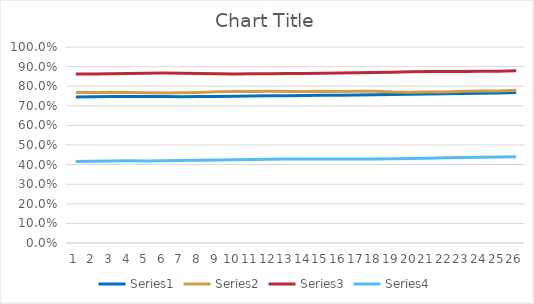
| Category | Series 0 | Series 1 | Series 2 | Series 3 |
|---|---|---|---|---|
| 0 | 0.745 | 0.767 | 0.862 | 0.415 |
| 1 | 0.746 | 0.768 | 0.863 | 0.417 |
| 2 | 0.747 | 0.769 | 0.864 | 0.418 |
| 3 | 0.747 | 0.768 | 0.865 | 0.419 |
| 4 | 0.747 | 0.766 | 0.866 | 0.419 |
| 5 | 0.747 | 0.766 | 0.867 | 0.42 |
| 6 | 0.747 | 0.766 | 0.866 | 0.42 |
| 7 | 0.747 | 0.768 | 0.864 | 0.422 |
| 8 | 0.748 | 0.771 | 0.863 | 0.423 |
| 9 | 0.749 | 0.773 | 0.863 | 0.424 |
| 10 | 0.75 | 0.774 | 0.863 | 0.426 |
| 11 | 0.751 | 0.774 | 0.864 | 0.428 |
| 12 | 0.752 | 0.773 | 0.865 | 0.428 |
| 13 | 0.752 | 0.773 | 0.865 | 0.429 |
| 14 | 0.753 | 0.774 | 0.866 | 0.429 |
| 15 | 0.754 | 0.773 | 0.867 | 0.428 |
| 16 | 0.755 | 0.774 | 0.868 | 0.428 |
| 17 | 0.757 | 0.774 | 0.87 | 0.429 |
| 18 | 0.757 | 0.771 | 0.872 | 0.43 |
| 19 | 0.759 | 0.77 | 0.873 | 0.431 |
| 20 | 0.761 | 0.77 | 0.875 | 0.433 |
| 21 | 0.762 | 0.771 | 0.875 | 0.434 |
| 22 | 0.763 | 0.774 | 0.875 | 0.437 |
| 23 | 0.764 | 0.775 | 0.876 | 0.438 |
| 24 | 0.766 | 0.776 | 0.877 | 0.438 |
| 25 | 0.768 | 0.78 | 0.878 | 0.44 |